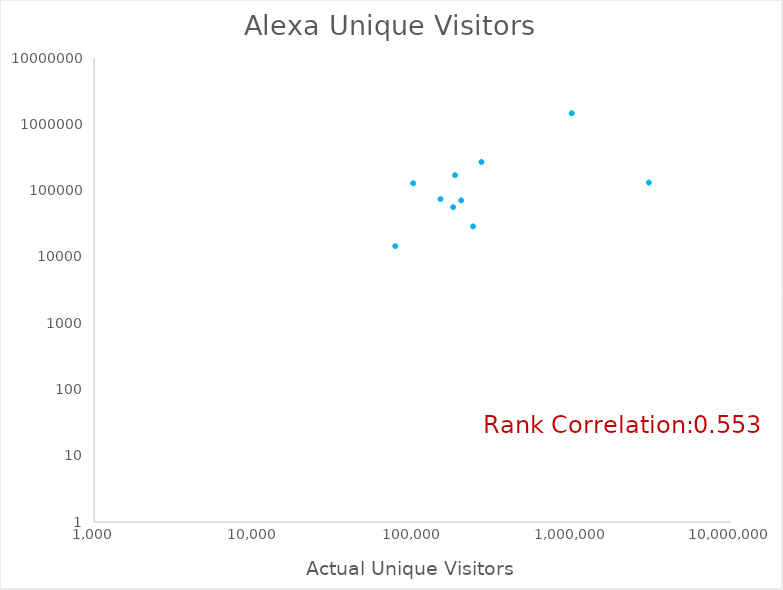
| Category | Alexa Unique Visitors |
|---|---|
| 57127.0 | 0 |
| 14843.0 | 0 |
| 120000.0 | 0 |
| 24000.0 | 0 |
| 3600.0 | 0 |
| 150000.0 | 74353 |
| 185000.0 | 170605 |
| 240080.0 | 28801 |
| 31412.0 | 0 |
| 22569.0 | 0 |
| 153037.0 | 0 |
| 78000.0 | 14498 |
| 202000.0 | 0 |
| 24417.0 | 0 |
| 60000.0 | 0 |
| 35000.0 | 0 |
| 1000000.0 | 1467994 |
| 350000.0 | 0 |
| 20485.0 | 0 |
| 271059.0 | 269944 |
| 101000.0 | 128769 |
| 800000.0 | 0 |
| 60000.0 | 0 |
| 180000.0 | 56135 |
| 15000.0 | 0 |
| 14000.0 | 0 |
| 55000.0 | 0 |
| 1057.0 | 0 |
| 10313.0 | 0 |
| 1225.0 | 0 |
| 60000.0 | 0 |
| 6790.0 | 0 |
| 202310.0 | 71191 |
| 40000.0 | 0 |
| 120000.0 | 0 |
| 3050000.0 | 131996 |
| 4835.0 | 0 |